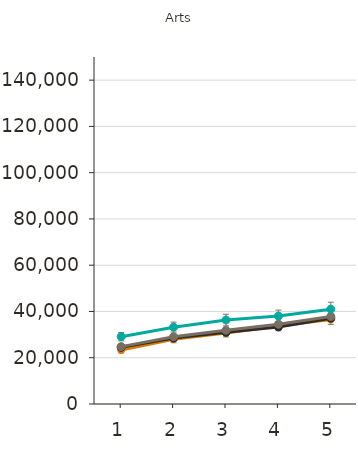
| Category | Certificat d'études collégial | Diplôme d'études collégial | Baccalauréat | Maîtrise | Doctorat | Grade professionnel |
|---|---|---|---|---|---|---|
| 1.0 | 23300 | 24500 | 24800 | 29100 |  |  |
| 2.0 | 28000 | 28500 | 29100 | 33200 |  |  |
| 3.0 | 30700 | 31000 | 31900 | 36300 |  |  |
| 4.0 | 33700 | 33300 | 34500 | 38000 |  |  |
| 5.0 | 36500 | 37100 | 37800 | 41000 |  |  |